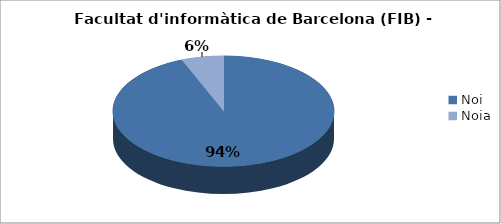
| Category | Facultat d'informàtica de Barcelona (FIB) - Gènere |
|---|---|
| Noi | 0.938 |
| Noia | 0.062 |